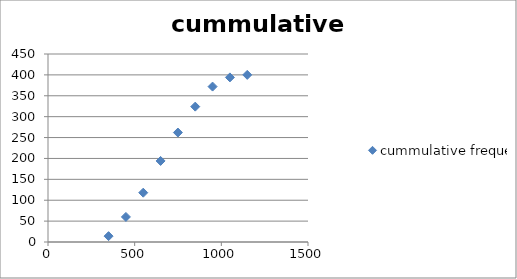
| Category | cummulative frequency |
|---|---|
| 349.5 | 14 |
| 449.5 | 60 |
| 549.5 | 118 |
| 649.5 | 194 |
| 749.5 | 262 |
| 849.5 | 324 |
| 949.5 | 372 |
| 1049.5 | 394 |
| 1149.5 | 400 |